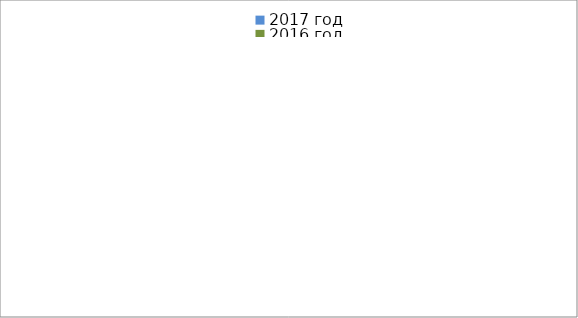
| Category | 2017 год | 2016 год |
|---|---|---|
|  - поджог | 3 | 4 |
|  - неосторожное обращение с огнём | 2 | 0 |
|  - НПТЭ электрооборудования | 7 | 2 |
|  - НПУ и Э печей | 22 | 16 |
|  - НПУ и Э транспортных средств | 18 | 16 |
|   -Шалость с огнем детей | 1 | 1 |
|  -НППБ при эксплуатации эл.приборов | 10 | 12 |
|  - курение | 10 | 8 |
| - прочие | 13 | 27 |
| - не установленные причины | 0 | 0 |